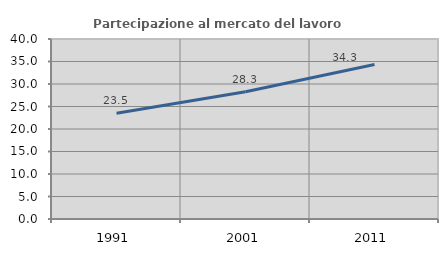
| Category | Partecipazione al mercato del lavoro  femminile |
|---|---|
| 1991.0 | 23.487 |
| 2001.0 | 28.293 |
| 2011.0 | 34.342 |